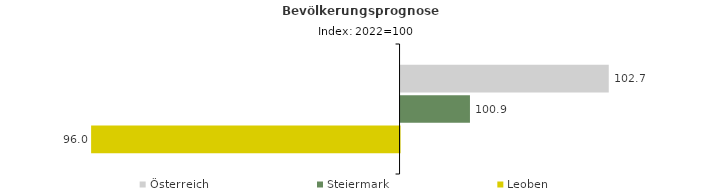
| Category | Österreich | Steiermark | Leoben |
|---|---|---|---|
| 2022.0 | 102.7 | 100.9 | 96 |